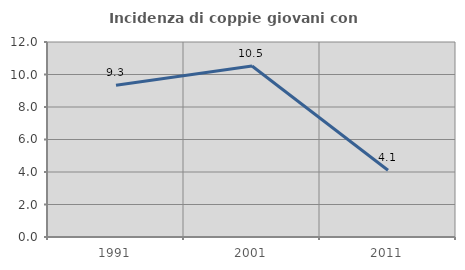
| Category | Incidenza di coppie giovani con figli |
|---|---|
| 1991.0 | 9.333 |
| 2001.0 | 10.526 |
| 2011.0 | 4.11 |